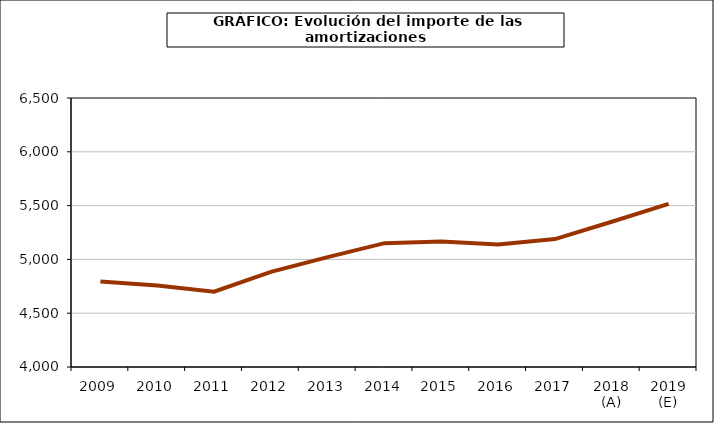
| Category | amortizacion |
|---|---|
| 2009 | 4794.062 |
| 2010 | 4758.255 |
| 2011 | 4699.859 |
| 2012 | 4884.543 |
| 2013 | 5021.523 |
| 2014 | 5151.042 |
| 2015 | 5167.348 |
| 2016 | 5137.515 |
| 2017 | 5189.174 |
| 2018 (A) | 5349.564 |
| 2019 (E) | 5516.228 |